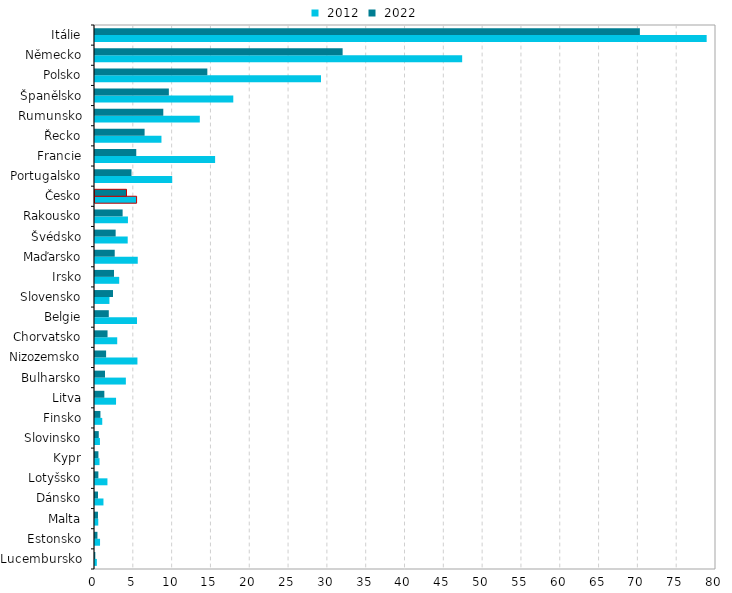
| Category |  2012 |  2022 |
|---|---|---|
| Lucembursko | 0.236 | 0.041 |
| Estonsko | 0.649 | 0.315 |
| Malta | 0.42 | 0.383 |
| Dánsko | 1.09 | 0.39 |
| Lotyšsko | 1.603 | 0.434 |
| Kypr | 0.582 | 0.441 |
| Slovinsko | 0.636 | 0.486 |
| Finsko | 0.934 | 0.7 |
| Litva | 2.711 | 1.203 |
| Bulharsko | 3.975 | 1.288 |
| Nizozemsko | 5.466 | 1.43 |
| Chorvatsko | 2.862 | 1.615 |
| Belgie | 5.412 | 1.777 |
| Slovensko | 1.86 | 2.32 |
| Irsko | 3.119 | 2.451 |
| Maďarsko | 5.508 | 2.541 |
| Švédsko | 4.213 | 2.661 |
| Rakousko | 4.243 | 3.558 |
| Česko | 5.358 | 4.059 |
| Portugalsko | 9.946 | 4.702 |
| Francie | 15.473 | 5.316 |
| Řecko | 8.562 | 6.39 |
| Rumunsko | 13.5 | 8.798 |
| Španělsko | 17.815 | 9.514 |
| Polsko | 29.114 | 14.472 |
| Německo | 47.3 | 31.9 |
| Itálie | 78.798 | 70.192 |